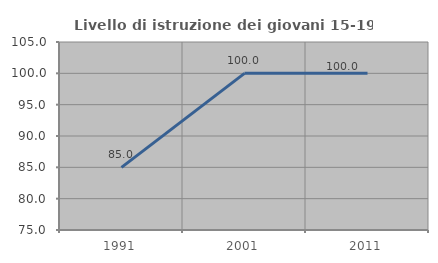
| Category | Livello di istruzione dei giovani 15-19 anni |
|---|---|
| 1991.0 | 85 |
| 2001.0 | 100 |
| 2011.0 | 100 |